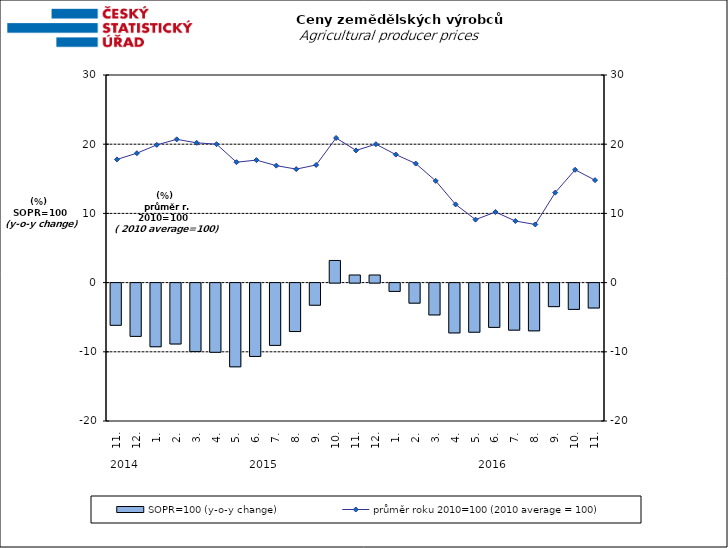
| Category | SOPR=100 (y-o-y change)   |
|---|---|
| 0 | -6.1 |
| 1 | -7.7 |
| 2 | -9.2 |
| 3 | -8.8 |
| 4 | -9.9 |
| 5 | -10 |
| 6 | -12.1 |
| 7 | -10.6 |
| 8 | -9 |
| 9 | -7 |
| 10 | -3.2 |
| 11 | 3.2 |
| 12 | 1.1 |
| 13 | 1.1 |
| 14 | -1.2 |
| 15 | -2.9 |
| 16 | -4.6 |
| 17 | -7.2 |
| 18 | -7.1 |
| 19 | -6.4 |
| 20 | -6.8 |
| 21 | -6.9 |
| 22 | -3.4 |
| 23 | -3.8 |
| 24 | -3.6 |